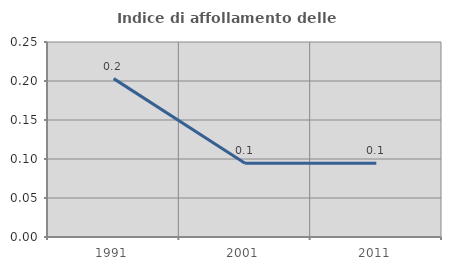
| Category | Indice di affollamento delle abitazioni  |
|---|---|
| 1991.0 | 0.203 |
| 2001.0 | 0.095 |
| 2011.0 | 0.094 |